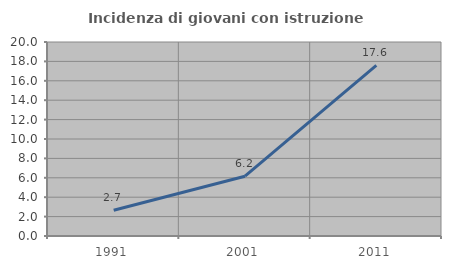
| Category | Incidenza di giovani con istruzione universitaria |
|---|---|
| 1991.0 | 2.655 |
| 2001.0 | 6.164 |
| 2011.0 | 17.593 |